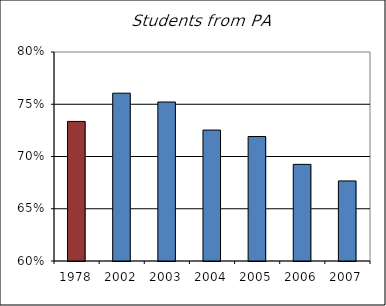
| Category | PA |
|---|---|
| 1978.0 | 0.734 |
| 2002.0 | 0.761 |
| 2003.0 | 0.752 |
| 2004.0 | 0.725 |
| 2005.0 | 0.719 |
| 2006.0 | 0.692 |
| 2007.0 | 0.677 |